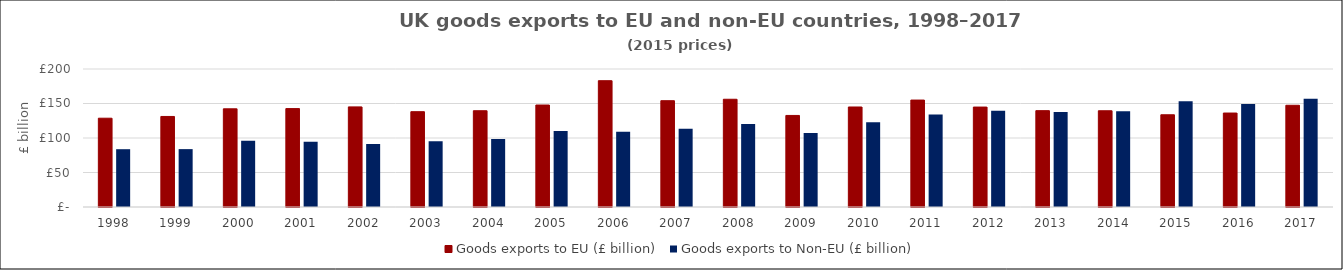
| Category | Goods exports to EU (£ billion) | Goods exports to Non-EU (£ billion) |
|---|---|---|
| 1998 | 128.677 | 83.763 |
| 1999 | 131.221 | 83.887 |
| 2000 | 142.288 | 95.997 |
| 2001 | 142.605 | 94.608 |
| 2002 | 145.09 | 91.267 |
| 2003 | 138.147 | 95.385 |
| 2004 | 139.533 | 98.62 |
| 2005 | 147.782 | 110.105 |
| 2006 | 183.039 | 109.036 |
| 2007 | 154.058 | 113.399 |
| 2008 | 156.145 | 120.455 |
| 2009 | 132.697 | 107.392 |
| 2010 | 144.943 | 122.898 |
| 2011 | 154.979 | 134.083 |
| 2012 | 144.825 | 139.494 |
| 2013 | 139.633 | 137.735 |
| 2014 | 139.48 | 138.883 |
| 2015 | 133.664 | 153.088 |
| 2016 | 136.169 | 149.206 |
| 2017 | 147.422 | 156.925 |